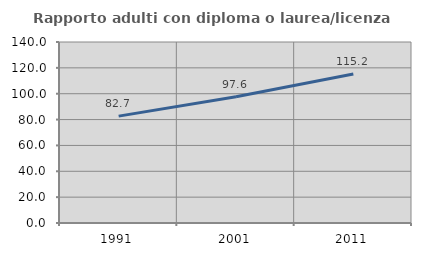
| Category | Rapporto adulti con diploma o laurea/licenza media  |
|---|---|
| 1991.0 | 82.668 |
| 2001.0 | 97.607 |
| 2011.0 | 115.183 |